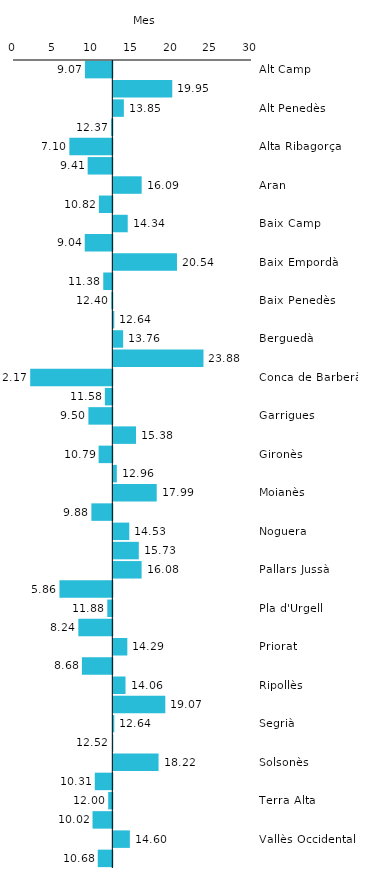
| Category | Series 0 |
|---|---|
| Alt Camp | 9.067 |
| Alt Empordà | 19.949 |
| Alt Penedès | 13.848 |
| Alt Urgell | 12.371 |
| Alta Ribagorça | 7.101 |
| Anoia | 9.409 |
| Aran | 16.09 |
| Bages | 10.825 |
| Baix Camp | 14.337 |
| Baix Ebre | 9.041 |
| Baix Empordà | 20.543 |
| Baix Llobregat | 11.376 |
| Baix Penedès | 12.397 |
| Barcelonès | 12.639 |
| Berguedà | 13.759 |
| Cerdanya | 23.882 |
| Conca de Barberà | 2.167 |
| Garraf | 11.579 |
| Garrigues | 9.502 |
| Garrotxa | 15.379 |
| Gironès | 10.79 |
| Maresme | 12.96 |
| Moianès | 17.989 |
| Montsià | 9.88 |
| Noguera | 14.53 |
| Osona | 15.731 |
| Pallars Jussà | 16.084 |
| Pallars Sobirà | 5.856 |
| Pla d'Urgell | 11.885 |
| Pla de l'Estany | 8.235 |
| Priorat | 14.286 |
| Ribera d'Ebre | 8.685 |
| Ripollès | 14.055 |
| Segarra | 19.074 |
| Segrià | 12.642 |
| Selva | 12.519 |
| Solsonès | 18.22 |
| Tarragonès | 10.307 |
| Terra Alta | 12 |
| Urgell | 10.024 |
| Vallès Occidental | 14.602 |
| Vallès Oriental | 10.683 |